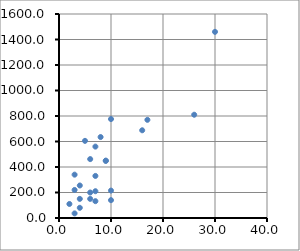
| Category | Series 0 |
|---|---|
| 7.0 | 560 |
| 3.0 | 220 |
| 3.0 | 340 |
| 4.0 | 80 |
| 6.0 | 150 |
| 7.0 | 330 |
| 2.0 | 110 |
| 7.0 | 210 |
| 30.0 | 1460 |
| 5.0 | 605 |
| 16.0 | 688 |
| 10.0 | 215 |
| 4.0 | 255 |
| 6.0 | 462 |
| 9.0 | 448 |
| 10.0 | 776 |
| 6.0 | 200 |
| 7.0 | 132 |
| 3.0 | 36 |
| 17.0 | 770 |
| 10.0 | 140 |
| 26.0 | 810 |
| 9.0 | 450 |
| 8.0 | 635 |
| 4.0 | 150 |